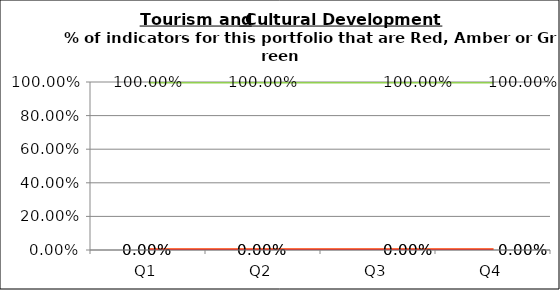
| Category | Green | Amber | Red |
|---|---|---|---|
| Q1 | 1 | 0 | 0 |
| Q2 | 1 | 0 | 0 |
| Q3 | 1 | 0 | 0 |
| Q4 | 1 | 0 | 0 |